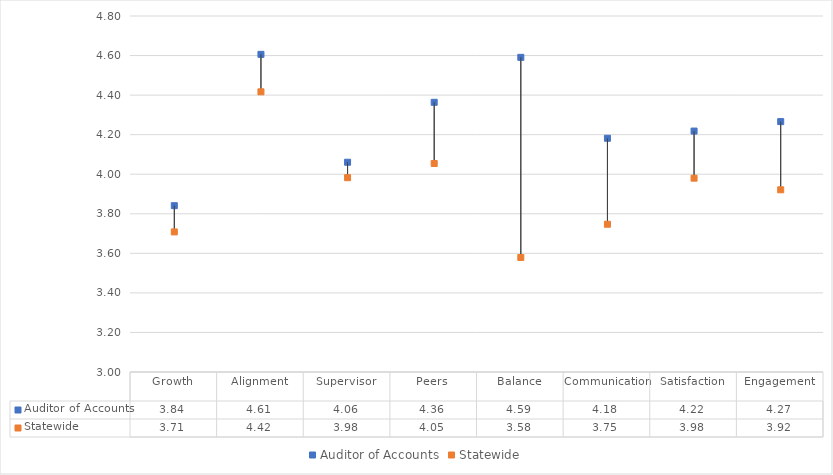
| Category | Auditor of Accounts | Statewide |
|---|---|---|
| Growth | 3.841 | 3.708 |
| Alignment | 4.606 | 4.417 |
| Supervisor | 4.061 | 3.983 |
| Peers | 4.364 | 4.054 |
| Balance | 4.591 | 3.579 |
| Communication | 4.182 | 3.747 |
| Satisfaction | 4.218 | 3.98 |
| Engagement | 4.266 | 3.921 |